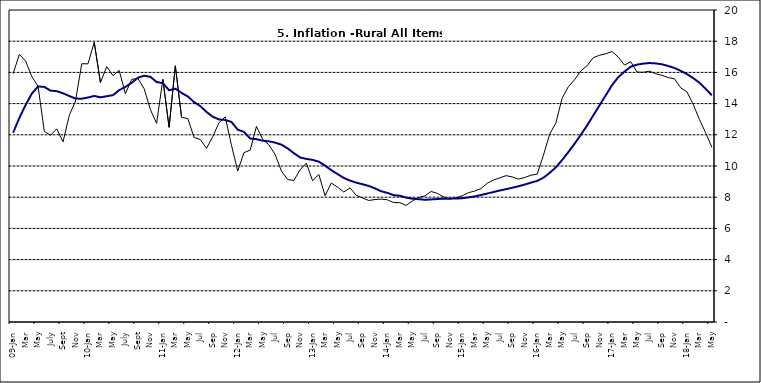
| Category | Series 0 | Series 1 |
|---|---|---|
| 09-Jan | 15.918 | 12.128 |
| Feb | 17.154 | 13.086 |
| Mar | 16.729 | 13.912 |
| Apr | 15.727 | 14.644 |
| May | 15.113 | 15.104 |
| June | 12.213 | 15.067 |
| July | 11.974 | 14.832 |
| Aug | 12.38 | 14.796 |
| Sept | 11.548 | 14.661 |
| Oct | 13.242 | 14.488 |
| Nov | 14.164 | 14.321 |
|  | 16.557 | 14.316 |
| 10-Jan | 16.548 | 14.39 |
| Feb | 17.934 | 14.494 |
| Mar | 15.346 | 14.401 |
| Apr | 16.373 | 14.473 |
| May | 15.794 | 14.54 |
| June | 16.126 | 14.862 |
| July | 14.634 | 15.072 |
| Aug | 15.556 | 15.33 |
| Sept | 15.616 | 15.658 |
| Oct | 14.955 | 15.786 |
| Nov | 13.616 | 15.719 |
| Dec | 12.735 | 15.385 |
| 11-Jan | 15.553 | 15.311 |
| Feb | 12.482 | 14.856 |
| Mar | 16.422 | 14.956 |
| Apr | 13.117 | 14.687 |
| May | 13.041 | 14.457 |
| Jun | 11.83 | 14.095 |
| Jul | 11.699 | 13.84 |
| Aug | 11.13 | 13.464 |
| Sep | 11.878 | 13.156 |
| Oct | 12.778 | 12.985 |
| Nov | 13.147 | 12.95 |
| Dec | 11.326 | 12.824 |
| 12-Jan | 9.678 | 12.33 |
| Feb | 10.856 | 12.188 |
| Mar | 11.014 | 11.76 |
| Apr | 12.536 | 11.724 |
| May | 11.712 | 11.621 |
| Jun | 11.36 | 11.582 |
| Jul | 10.733 | 11.499 |
| Aug | 9.683 | 11.368 |
| Sep | 9.132 | 11.131 |
| Oct | 9.071 | 10.82 |
| Nov | 9.758 | 10.548 |
| Dec | 10.183 | 10.455 |
| 13-Jan | 9.052 | 10.394 |
| Feb | 9.457 | 10.276 |
| Mar | 8.091 | 10.025 |
| Apr | 8.907 | 9.732 |
| May | 8.647 | 9.483 |
| Jun | 8.333 | 9.236 |
| Jul | 8.6 | 9.063 |
| Aug | 8.12 | 8.933 |
| Sep | 7.95 | 8.832 |
| Oct | 7.791 | 8.722 |
| Nov | 7.849 | 8.565 |
| Dec | 7.879 | 8.378 |
| 14-Jan | 7.832 | 8.277 |
| Feb | 7.657 | 8.13 |
| Mar | 7.65 | 8.092 |
| Apr | 7.473 | 7.973 |
| May | 7.761 | 7.901 |
| Jun | 7.98 | 7.874 |
| Jul | 8.086 | 7.834 |
| Aug | 8.368 | 7.858 |
| Sep | 8.244 | 7.883 |
| Oct | 8.019 | 7.903 |
| Nov | 7.898 | 7.906 |
| Dec | 7.955 | 7.913 |
| 15-Jan | 8.094 | 7.935 |
| Feb | 8.291 | 7.988 |
| Mar | 8.396 | 8.05 |
| Apr | 8.556 | 8.14 |
| May | 8.896 | 8.236 |
| Jun | 9.098 | 8.331 |
| Jul | 9.238 | 8.429 |
| Aug | 9.382 | 8.516 |
| Sep | 9.3 | 8.606 |
| Oct | 9.162 | 8.7 |
| Nov | 9.261 | 8.813 |
| Dec | 9.41 | 8.933 |
| 16-Jan | 9.48 | 9.047 |
| Feb | 10.692 | 9.249 |
| Mar | 12.038 | 9.559 |
| Apr | 12.767 | 9.917 |
| May | 14.349 | 10.384 |
| Jun | 15.088 | 10.897 |
| Jul | 15.533 | 11.433 |
| Aug | 16.103 | 12.002 |
| Sep | 16.428 | 12.601 |
| Oct | 16.947 | 13.25 |
| Nov | 17.099 | 13.898 |
| Dec | 17.195 | 14.54 |
| 17-Jan | 17.341 | 15.183 |
| Feb | 16.982 | 15.696 |
| Mar | 16.466 | 16.054 |
| Apr | 16.687 | 16.369 |
| May | 16.023 | 16.497 |
| Jun | 16.007 | 16.563 |
| Jul | 16.078 | 16.6 |
| Aug | 15.914 | 16.577 |
| Sep | 15.812 | 16.52 |
| Oct | 15.666 | 16.411 |
| Nov | 15.587 | 16.285 |
| Dec | 15.018 | 16.104 |
| 18-Jan | 14.756 | 15.892 |
| Feb | 13.957 | 15.638 |
| Mar | 12.987 | 15.339 |
| Apr | 12.126 | 14.95 |
| May | 11.199 | 14.53 |